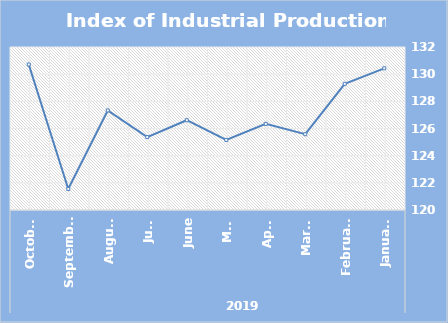
| Category | Index |
|---|---|
| 0 | 130.43 |
| 1 | 129.29 |
| 2 | 125.58 |
| 3 | 126.34 |
| 4 | 125.16 |
| 5 | 126.61 |
| 6 | 125.37 |
| 7 | 127.33 |
| 8 | 121.55 |
| 9 | 130.713 |